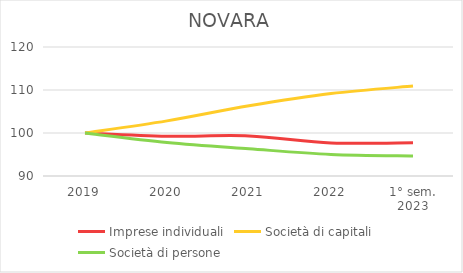
| Category | Imprese individuali | Società di capitali | Società di persone |
|---|---|---|---|
| 2019 | 100 | 100 | 100 |
| 2020 | 99.253 | 102.816 | 97.807 |
| 2021 | 99.331 | 106.322 | 96.327 |
| 2022 | 97.691 | 109.167 | 95.027 |
| 1° sem.
2023 | 97.72 | 110.92 | 94.67 |